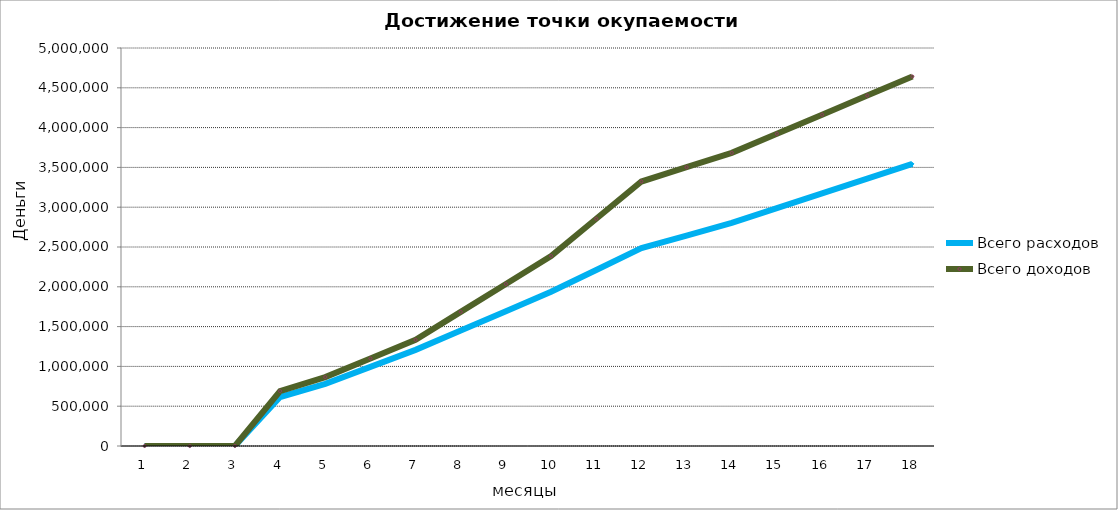
| Category | Всего расходов | Всего доходов |
|---|---|---|
| 0 | 0 | 0 |
| 1 | 0 | 0 |
| 2 | 0 | 0 |
| 3 | 615511.8 | 690000 |
| 4 | 781663.2 | 865500 |
| 5 | 994614.6 | 1099500 |
| 6 | 1207566 | 1333500 |
| 7 | 1450937.4 | 1684500 |
| 8 | 1694308.8 | 2035500 |
| 9 | 1937680.2 | 2386500 |
| 10 | 2211471.6 | 2854500 |
| 11 | 2485263 | 3322500 |
| 12 | 2643851.61 | 3502500 |
| 13 | 2802440.22 | 3682500 |
| 14 | 2987878.83 | 3922500 |
| 15 | 3173317.44 | 4162500 |
| 16 | 3358756.05 | 4402500 |
| 17 | 3544194.66 | 4642500 |